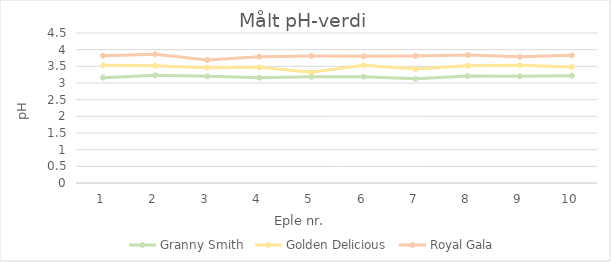
| Category | Granny Smith | Golden Delicious | Royal Gala |
|---|---|---|---|
| 0 | 3.16 | 3.53 | 3.82 |
| 1 | 3.23 | 3.52 | 3.86 |
| 2 | 3.2 | 3.46 | 3.69 |
| 3 | 3.16 | 3.47 | 3.79 |
| 4 | 3.19 | 3.32 | 3.81 |
| 5 | 3.19 | 3.53 | 3.8 |
| 6 | 3.13 | 3.42 | 3.81 |
| 7 | 3.21 | 3.52 | 3.84 |
| 8 | 3.2 | 3.53 | 3.79 |
| 9 | 3.22 | 3.48 | 3.83 |